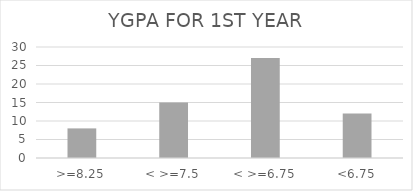
| Category | SGPA1 | SGPA2 | YGPA |
|---|---|---|---|
| >=8.25 |  |  | 8 |
| < >=7.5 |  |  | 15 |
| < >=6.75 |  |  | 27 |
| <6.75 |  |  | 12 |